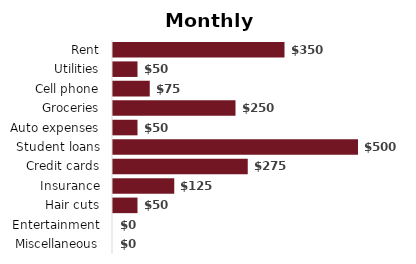
| Category | Amount |
|---|---|
| Rent | 350 |
| Utilities | 50 |
| Cell phone | 75 |
| Groceries | 250 |
| Auto expenses | 50 |
| Student loans | 500 |
| Credit cards | 275 |
| Insurance | 125 |
| Hair cuts | 50 |
| Entertainment | 0 |
| Miscellaneous | 0 |